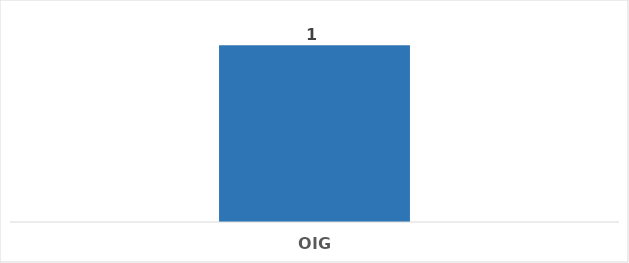
| Category | Total |
|---|---|
| OIG | 1 |